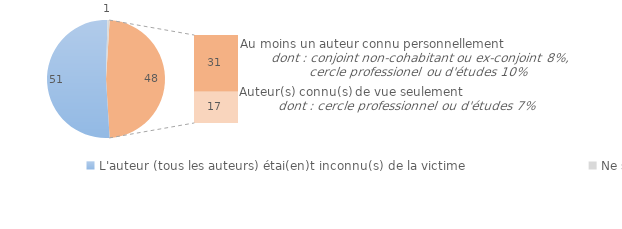
| Category | Series 0 |
|---|---|
| L'auteur (tous les auteurs) étai(en)t inconnu(s) de la victime | 51.336 |
| Ne sait pas/Refus | 0.594 |
| L'auteur (au moins un auteur) était connu de vue ou personnellement  | 31 |